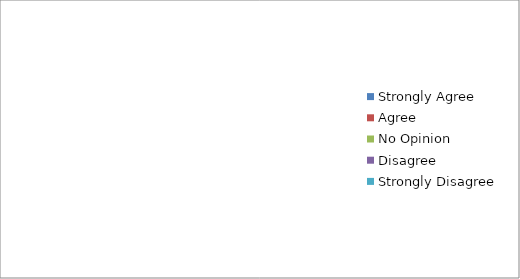
| Category | Strongly Agree  | Agree | No Opinion  | Disagree | Strongly Disagree  |
|---|---|---|---|---|---|
| 0 | 20 | 5 | 3 | 2 | 0 |
| 1 | 15 | 5 | 5 | 2 | 3 |
| 2 | 5 | 18 | 2 | 5 | 0 |
| 3 | 6 | 16 | 4 | 4 | 0 |
| 4 | 14 | 10 | 4 | 2 | 2 |
| 5 | 10 | 20 | 0 | 0 | 0 |
| 6 | 2 | 20 | 3 | 5 | 0 |
| 7 | 3 | 22 | 2 | 3 | 2 |
| 8 | 0 | 20 | 5 | 3 | 2 |
| 9 | 6 | 16 | 6 | 2 | 0 |
| 10 | 0 | 20 | 5 | 5 | 0 |
| 11 | 2 | 25 | 2 | 1 | 0 |
| 12 | 20 | 8 | 2 | 0 | 0 |
| 13 | 18 | 6 | 4 | 3 | 1 |
| 14 | 4 | 20 | 3 | 3 | 0 |
| 15 | 4 | 25 | 1 | 0 | 0 |
| 16 | 5 | 15 | 5 | 5 | 0 |
| 17 | 20 | 5 | 3 | 2 | 0 |
| 18 | 4 | 24 | 1 | 1 | 0 |
| 19 | 4 | 18 | 4 | 3 | 1 |